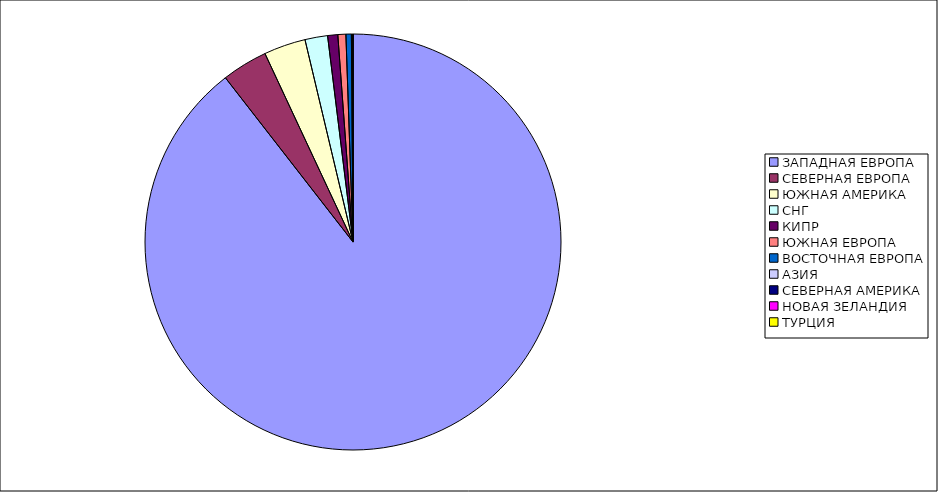
| Category | Оборот |
|---|---|
| ЗАПАДНАЯ ЕВРОПА | 0.895 |
| СЕВЕРНАЯ ЕВРОПА | 0.036 |
| ЮЖНАЯ АМЕРИКА | 0.032 |
| СНГ | 0.018 |
| КИПР | 0.008 |
| ЮЖНАЯ ЕВРОПА | 0.006 |
| ВОСТОЧНАЯ ЕВРОПА | 0.004 |
| АЗИЯ | 0.001 |
| СЕВЕРНАЯ АМЕРИКА | 0.001 |
| НОВАЯ ЗЕЛАНДИЯ | 0 |
| ТУРЦИЯ | 0 |